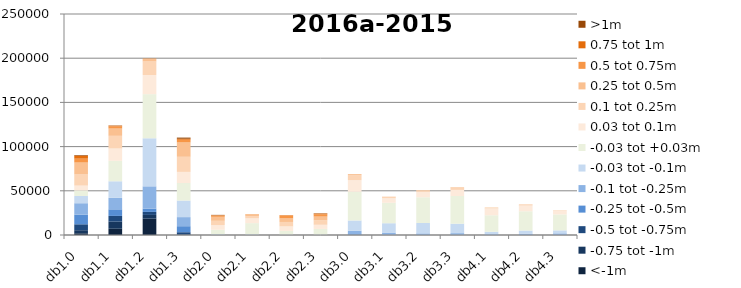
| Category | <-1m | -0.75 tot -1m | -0.5 tot -0.75m | -0.25 tot -0.5m | -0.1 tot -0.25m | -0.03 tot -0.1m | -0.03 tot +0.03m | 0.03 tot 0.1m | 0.1 tot 0.25m | 0.25 tot 0.5m | 0.5 tot 0.75m | 0.75 tot 1m | >1m |
|---|---|---|---|---|---|---|---|---|---|---|---|---|---|
| db1.0 | 1942 | 3476 | 6699 | 10974 | 12856 | 8146 | 6301 | 5502 | 12587 | 13481 | 4412 | 3279 | 734 |
| db1.1 | 7071 | 8005 | 6514 | 7449 | 13016 | 18728 | 23112 | 13972 | 14321 | 8244 | 2425 | 790 | 282 |
| db1.2 | 18483 | 4237 | 3418 | 3608 | 25309 | 54361 | 49870 | 21721 | 15262 | 2586 | 657 | 69 | 0 |
| db1.3 | 216 | 561 | 2362 | 6817 | 10275 | 18725 | 19821 | 12610 | 17092 | 16222 | 3070 | 1138 | 1275 |
| db2.0 | 0 | 0 | 0 | 40 | 196 | 584 | 5104 | 5345 | 4797 | 4517 | 1416 | 382 | 381 |
| db2.1 | 0 | 0 | 0 | 7 | 79 | 691 | 12648 | 5482 | 2149 | 1670 | 530 | 85 | 0 |
| db2.2 | 0 | 0 | 0 | 0 | 107 | 350 | 4191 | 5107 | 4985 | 4086 | 3119 | 500 | 29 |
| db2.3 | 0 | 0 | 2 | 11 | 50 | 449 | 6368 | 4688 | 5048 | 4243 | 2455 | 908 | 329 |
| db3.0 | 153 | 27 | 53 | 500 | 4149 | 11515 | 32550 | 13110 | 5691 | 969 | 119 | 42 | 20 |
| db3.1 | 26 | 11 | 28 | 247 | 2451 | 10543 | 23139 | 5265 | 1537 | 165 | 12 | 0 | 1 |
| db3.2 | 0 | 1 | 4 | 119 | 1723 | 11701 | 29135 | 6119 | 1861 | 257 | 17 | 4 | 3 |
| db3.3 | 2 | 4 | 48 | 233 | 1821 | 10670 | 31360 | 6903 | 2197 | 539 | 107 | 27 | 9 |
| db4.1 | 2 | 1 | 2 | 68 | 772 | 2741 | 18761 | 7702 | 1118 | 88 | 2 | 0 | 0 |
| db4.2 | 3 | 6 | 13 | 126 | 1144 | 3746 | 21797 | 6489 | 1300 | 153 | 12 | 3 | 1 |
| db4.3 | 0 | 6 | 35 | 132 | 1702 | 3370 | 18022 | 3905 | 570 | 75 | 7 | 0 | 1 |